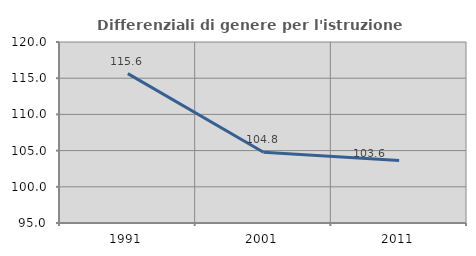
| Category | Differenziali di genere per l'istruzione superiore |
|---|---|
| 1991.0 | 115.627 |
| 2001.0 | 104.767 |
| 2011.0 | 103.641 |